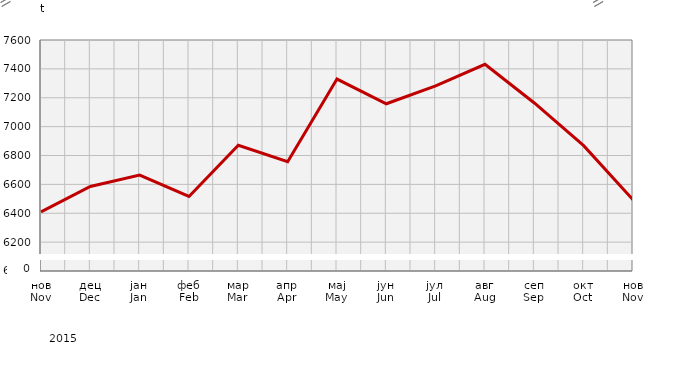
| Category | Прикупљање крављег млијека
Collecting of cow’s milk |
|---|---|
| нов
Nov | 6409.6 |
| дец
Dec | 6585.351 |
| јан
Jan | 6663.893 |
| феб
Feb | 6516.44 |
| мар
Mar | 6870.8 |
| апр
Apr | 6757.289 |
| мај
May | 7329.328 |
| јун
Jun | 7158.306 |
| јул
Jul | 7282.65 |
| авг
Aug | 7431.863 |
| сеп
Sep | 7163.964 |
| окт
Oct | 6867.986 |
| нов
Nov | 6493.2 |